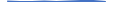
| Category | Series 0 |
|---|---|
| 0 | 1 |
| 1 | 0 |
| 2 | 0 |
| 3 | 1 |
| 4 | 0 |
| 5 | 1 |
| 6 | 2 |
| 7 | 2 |
| 8 | 0 |